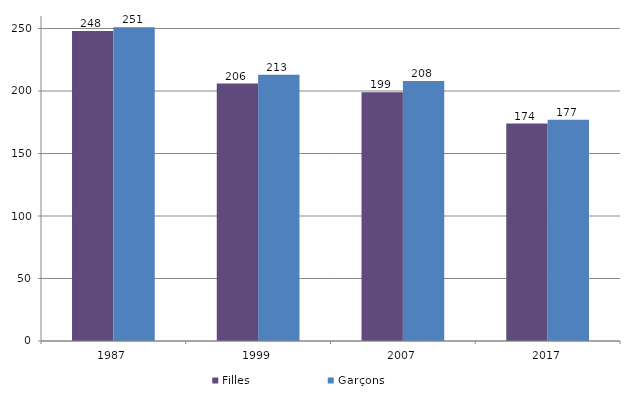
| Category | Filles | Garçons |
|---|---|---|
| 1987.0 | 248 | 251 |
| 1999.0 | 206 | 213 |
| 2007.0 | 199 | 208 |
| 2017.0 | 174 | 177 |